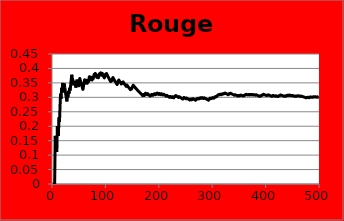
| Category | Rouge Cum |
|---|---|
| 0 | 0 |
| 1 | 0 |
| 2 | 0 |
| 3 | 0 |
| 4 | 0 |
| 5 | 0.167 |
| 6 | 0.143 |
| 7 | 0.125 |
| 8 | 0.111 |
| 9 | 0.2 |
| 10 | 0.182 |
| 11 | 0.167 |
| 12 | 0.231 |
| 13 | 0.214 |
| 14 | 0.267 |
| 15 | 0.312 |
| 16 | 0.294 |
| 17 | 0.333 |
| 18 | 0.316 |
| 19 | 0.35 |
| 20 | 0.333 |
| 21 | 0.318 |
| 22 | 0.348 |
| 23 | 0.333 |
| 24 | 0.32 |
| 25 | 0.308 |
| 26 | 0.296 |
| 27 | 0.286 |
| 28 | 0.31 |
| 29 | 0.3 |
| 30 | 0.323 |
| 31 | 0.312 |
| 32 | 0.333 |
| 33 | 0.324 |
| 34 | 0.343 |
| 35 | 0.361 |
| 36 | 0.378 |
| 37 | 0.368 |
| 38 | 0.359 |
| 39 | 0.35 |
| 40 | 0.341 |
| 41 | 0.357 |
| 42 | 0.349 |
| 43 | 0.341 |
| 44 | 0.333 |
| 45 | 0.348 |
| 46 | 0.362 |
| 47 | 0.354 |
| 48 | 0.347 |
| 49 | 0.34 |
| 50 | 0.353 |
| 51 | 0.365 |
| 52 | 0.358 |
| 53 | 0.352 |
| 54 | 0.345 |
| 55 | 0.339 |
| 56 | 0.333 |
| 57 | 0.328 |
| 58 | 0.339 |
| 59 | 0.35 |
| 60 | 0.361 |
| 61 | 0.355 |
| 62 | 0.349 |
| 63 | 0.359 |
| 64 | 0.354 |
| 65 | 0.348 |
| 66 | 0.358 |
| 67 | 0.353 |
| 68 | 0.362 |
| 69 | 0.371 |
| 70 | 0.366 |
| 71 | 0.361 |
| 72 | 0.37 |
| 73 | 0.365 |
| 74 | 0.36 |
| 75 | 0.368 |
| 76 | 0.364 |
| 77 | 0.372 |
| 78 | 0.38 |
| 79 | 0.375 |
| 80 | 0.383 |
| 81 | 0.378 |
| 82 | 0.373 |
| 83 | 0.369 |
| 84 | 0.376 |
| 85 | 0.372 |
| 86 | 0.368 |
| 87 | 0.375 |
| 88 | 0.382 |
| 89 | 0.378 |
| 90 | 0.385 |
| 91 | 0.38 |
| 92 | 0.376 |
| 93 | 0.383 |
| 94 | 0.379 |
| 95 | 0.375 |
| 96 | 0.371 |
| 97 | 0.367 |
| 98 | 0.374 |
| 99 | 0.38 |
| 100 | 0.376 |
| 101 | 0.382 |
| 102 | 0.379 |
| 103 | 0.375 |
| 104 | 0.371 |
| 105 | 0.368 |
| 106 | 0.364 |
| 107 | 0.361 |
| 108 | 0.358 |
| 109 | 0.355 |
| 110 | 0.36 |
| 111 | 0.357 |
| 112 | 0.363 |
| 113 | 0.368 |
| 114 | 0.365 |
| 115 | 0.362 |
| 116 | 0.359 |
| 117 | 0.356 |
| 118 | 0.353 |
| 119 | 0.35 |
| 120 | 0.347 |
| 121 | 0.344 |
| 122 | 0.35 |
| 123 | 0.355 |
| 124 | 0.36 |
| 125 | 0.357 |
| 126 | 0.354 |
| 127 | 0.352 |
| 128 | 0.349 |
| 129 | 0.346 |
| 130 | 0.351 |
| 131 | 0.348 |
| 132 | 0.353 |
| 133 | 0.351 |
| 134 | 0.348 |
| 135 | 0.346 |
| 136 | 0.343 |
| 137 | 0.341 |
| 138 | 0.338 |
| 139 | 0.343 |
| 140 | 0.34 |
| 141 | 0.338 |
| 142 | 0.336 |
| 143 | 0.333 |
| 144 | 0.331 |
| 145 | 0.329 |
| 146 | 0.327 |
| 147 | 0.331 |
| 148 | 0.329 |
| 149 | 0.333 |
| 150 | 0.338 |
| 151 | 0.342 |
| 152 | 0.34 |
| 153 | 0.338 |
| 154 | 0.335 |
| 155 | 0.333 |
| 156 | 0.331 |
| 157 | 0.329 |
| 158 | 0.327 |
| 159 | 0.325 |
| 160 | 0.323 |
| 161 | 0.321 |
| 162 | 0.319 |
| 163 | 0.317 |
| 164 | 0.315 |
| 165 | 0.313 |
| 166 | 0.311 |
| 167 | 0.31 |
| 168 | 0.308 |
| 169 | 0.306 |
| 170 | 0.31 |
| 171 | 0.308 |
| 172 | 0.306 |
| 173 | 0.31 |
| 174 | 0.314 |
| 175 | 0.312 |
| 176 | 0.311 |
| 177 | 0.309 |
| 178 | 0.313 |
| 179 | 0.311 |
| 180 | 0.309 |
| 181 | 0.308 |
| 182 | 0.306 |
| 183 | 0.304 |
| 184 | 0.308 |
| 185 | 0.306 |
| 186 | 0.31 |
| 187 | 0.309 |
| 188 | 0.307 |
| 189 | 0.311 |
| 190 | 0.309 |
| 191 | 0.312 |
| 192 | 0.311 |
| 193 | 0.309 |
| 194 | 0.313 |
| 195 | 0.311 |
| 196 | 0.315 |
| 197 | 0.313 |
| 198 | 0.312 |
| 199 | 0.31 |
| 200 | 0.313 |
| 201 | 0.312 |
| 202 | 0.31 |
| 203 | 0.309 |
| 204 | 0.312 |
| 205 | 0.311 |
| 206 | 0.309 |
| 207 | 0.308 |
| 208 | 0.311 |
| 209 | 0.31 |
| 210 | 0.308 |
| 211 | 0.307 |
| 212 | 0.305 |
| 213 | 0.304 |
| 214 | 0.307 |
| 215 | 0.306 |
| 216 | 0.304 |
| 217 | 0.303 |
| 218 | 0.301 |
| 219 | 0.3 |
| 220 | 0.303 |
| 221 | 0.302 |
| 222 | 0.3 |
| 223 | 0.299 |
| 224 | 0.302 |
| 225 | 0.301 |
| 226 | 0.3 |
| 227 | 0.298 |
| 228 | 0.301 |
| 229 | 0.304 |
| 230 | 0.303 |
| 231 | 0.306 |
| 232 | 0.305 |
| 233 | 0.303 |
| 234 | 0.302 |
| 235 | 0.301 |
| 236 | 0.3 |
| 237 | 0.303 |
| 238 | 0.301 |
| 239 | 0.3 |
| 240 | 0.299 |
| 241 | 0.298 |
| 242 | 0.296 |
| 243 | 0.295 |
| 244 | 0.294 |
| 245 | 0.297 |
| 246 | 0.3 |
| 247 | 0.298 |
| 248 | 0.297 |
| 249 | 0.296 |
| 250 | 0.295 |
| 251 | 0.298 |
| 252 | 0.296 |
| 253 | 0.295 |
| 254 | 0.294 |
| 255 | 0.293 |
| 256 | 0.292 |
| 257 | 0.291 |
| 258 | 0.293 |
| 259 | 0.292 |
| 260 | 0.291 |
| 261 | 0.294 |
| 262 | 0.293 |
| 263 | 0.295 |
| 264 | 0.294 |
| 265 | 0.293 |
| 266 | 0.292 |
| 267 | 0.291 |
| 268 | 0.29 |
| 269 | 0.293 |
| 270 | 0.295 |
| 271 | 0.294 |
| 272 | 0.297 |
| 273 | 0.296 |
| 274 | 0.295 |
| 275 | 0.297 |
| 276 | 0.296 |
| 277 | 0.299 |
| 278 | 0.297 |
| 279 | 0.296 |
| 280 | 0.299 |
| 281 | 0.298 |
| 282 | 0.297 |
| 283 | 0.296 |
| 284 | 0.298 |
| 285 | 0.297 |
| 286 | 0.296 |
| 287 | 0.295 |
| 288 | 0.294 |
| 289 | 0.293 |
| 290 | 0.292 |
| 291 | 0.291 |
| 292 | 0.29 |
| 293 | 0.293 |
| 294 | 0.295 |
| 295 | 0.297 |
| 296 | 0.296 |
| 297 | 0.295 |
| 298 | 0.298 |
| 299 | 0.297 |
| 300 | 0.299 |
| 301 | 0.298 |
| 302 | 0.297 |
| 303 | 0.299 |
| 304 | 0.302 |
| 305 | 0.301 |
| 306 | 0.303 |
| 307 | 0.302 |
| 308 | 0.304 |
| 309 | 0.306 |
| 310 | 0.309 |
| 311 | 0.308 |
| 312 | 0.31 |
| 313 | 0.309 |
| 314 | 0.311 |
| 315 | 0.31 |
| 316 | 0.309 |
| 317 | 0.311 |
| 318 | 0.31 |
| 319 | 0.312 |
| 320 | 0.312 |
| 321 | 0.314 |
| 322 | 0.313 |
| 323 | 0.315 |
| 324 | 0.314 |
| 325 | 0.313 |
| 326 | 0.312 |
| 327 | 0.311 |
| 328 | 0.31 |
| 329 | 0.309 |
| 330 | 0.311 |
| 331 | 0.313 |
| 332 | 0.312 |
| 333 | 0.314 |
| 334 | 0.313 |
| 335 | 0.312 |
| 336 | 0.312 |
| 337 | 0.311 |
| 338 | 0.31 |
| 339 | 0.309 |
| 340 | 0.308 |
| 341 | 0.307 |
| 342 | 0.309 |
| 343 | 0.308 |
| 344 | 0.307 |
| 345 | 0.306 |
| 346 | 0.305 |
| 347 | 0.305 |
| 348 | 0.307 |
| 349 | 0.306 |
| 350 | 0.305 |
| 351 | 0.307 |
| 352 | 0.306 |
| 353 | 0.308 |
| 354 | 0.307 |
| 355 | 0.306 |
| 356 | 0.305 |
| 357 | 0.304 |
| 358 | 0.306 |
| 359 | 0.306 |
| 360 | 0.307 |
| 361 | 0.309 |
| 362 | 0.309 |
| 363 | 0.31 |
| 364 | 0.31 |
| 365 | 0.309 |
| 366 | 0.308 |
| 367 | 0.31 |
| 368 | 0.309 |
| 369 | 0.308 |
| 370 | 0.31 |
| 371 | 0.309 |
| 372 | 0.308 |
| 373 | 0.31 |
| 374 | 0.309 |
| 375 | 0.309 |
| 376 | 0.308 |
| 377 | 0.31 |
| 378 | 0.309 |
| 379 | 0.308 |
| 380 | 0.307 |
| 381 | 0.309 |
| 382 | 0.308 |
| 383 | 0.307 |
| 384 | 0.306 |
| 385 | 0.306 |
| 386 | 0.305 |
| 387 | 0.304 |
| 388 | 0.303 |
| 389 | 0.305 |
| 390 | 0.304 |
| 391 | 0.306 |
| 392 | 0.308 |
| 393 | 0.307 |
| 394 | 0.309 |
| 395 | 0.311 |
| 396 | 0.31 |
| 397 | 0.309 |
| 398 | 0.308 |
| 399 | 0.308 |
| 400 | 0.307 |
| 401 | 0.306 |
| 402 | 0.308 |
| 403 | 0.307 |
| 404 | 0.309 |
| 405 | 0.308 |
| 406 | 0.307 |
| 407 | 0.306 |
| 408 | 0.306 |
| 409 | 0.305 |
| 410 | 0.304 |
| 411 | 0.303 |
| 412 | 0.305 |
| 413 | 0.307 |
| 414 | 0.306 |
| 415 | 0.305 |
| 416 | 0.305 |
| 417 | 0.304 |
| 418 | 0.305 |
| 419 | 0.305 |
| 420 | 0.304 |
| 421 | 0.303 |
| 422 | 0.303 |
| 423 | 0.304 |
| 424 | 0.306 |
| 425 | 0.305 |
| 426 | 0.307 |
| 427 | 0.308 |
| 428 | 0.308 |
| 429 | 0.307 |
| 430 | 0.306 |
| 431 | 0.306 |
| 432 | 0.305 |
| 433 | 0.304 |
| 434 | 0.303 |
| 435 | 0.305 |
| 436 | 0.304 |
| 437 | 0.304 |
| 438 | 0.305 |
| 439 | 0.307 |
| 440 | 0.306 |
| 441 | 0.308 |
| 442 | 0.307 |
| 443 | 0.306 |
| 444 | 0.308 |
| 445 | 0.307 |
| 446 | 0.306 |
| 447 | 0.306 |
| 448 | 0.305 |
| 449 | 0.307 |
| 450 | 0.306 |
| 451 | 0.305 |
| 452 | 0.305 |
| 453 | 0.304 |
| 454 | 0.303 |
| 455 | 0.305 |
| 456 | 0.304 |
| 457 | 0.303 |
| 458 | 0.305 |
| 459 | 0.304 |
| 460 | 0.306 |
| 461 | 0.305 |
| 462 | 0.305 |
| 463 | 0.304 |
| 464 | 0.303 |
| 465 | 0.305 |
| 466 | 0.304 |
| 467 | 0.303 |
| 468 | 0.303 |
| 469 | 0.302 |
| 470 | 0.301 |
| 471 | 0.301 |
| 472 | 0.3 |
| 473 | 0.3 |
| 474 | 0.299 |
| 475 | 0.298 |
| 476 | 0.3 |
| 477 | 0.299 |
| 478 | 0.301 |
| 479 | 0.3 |
| 480 | 0.299 |
| 481 | 0.299 |
| 482 | 0.3 |
| 483 | 0.302 |
| 484 | 0.301 |
| 485 | 0.3 |
| 486 | 0.3 |
| 487 | 0.301 |
| 488 | 0.301 |
| 489 | 0.302 |
| 490 | 0.301 |
| 491 | 0.301 |
| 492 | 0.302 |
| 493 | 0.302 |
| 494 | 0.301 |
| 495 | 0.3 |
| 496 | 0.302 |
| 497 | 0.301 |
| 498 | 0.301 |
| 499 | 0.302 |